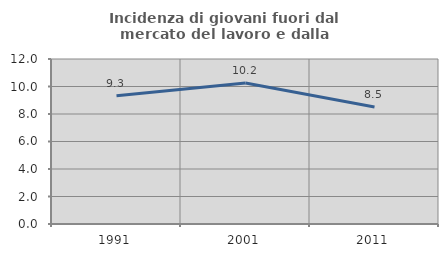
| Category | Incidenza di giovani fuori dal mercato del lavoro e dalla formazione  |
|---|---|
| 1991.0 | 9.331 |
| 2001.0 | 10.249 |
| 2011.0 | 8.513 |